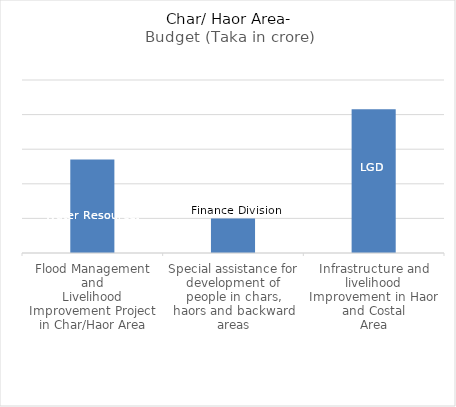
| Category | Budget (Taka in crore) |
|---|---|
| Flood Management and
Livelihood Improvement Project in Char/Haor Area | 135 |
| Special assistance for development of people in chars,
haors and backward areas | 50 |
| Infrastructure and livelihood Improvement in Haor and Costal
Area | 207.61 |